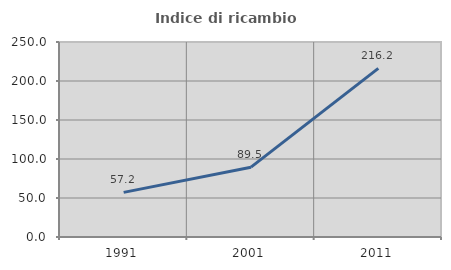
| Category | Indice di ricambio occupazionale  |
|---|---|
| 1991.0 | 57.208 |
| 2001.0 | 89.51 |
| 2011.0 | 216.232 |